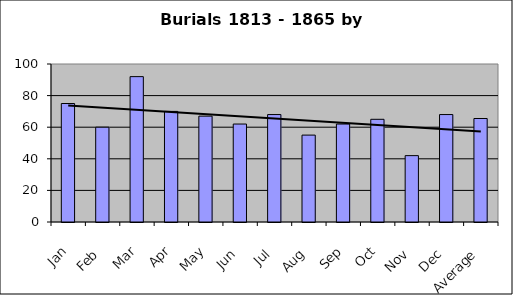
| Category | Series 0 |
|---|---|
| Jan | 75 |
| Feb | 60 |
| Mar | 92 |
| Apr | 70 |
| May | 67 |
| Jun | 62 |
| Jul | 68 |
| Aug | 55 |
| Sep | 62 |
| Oct | 65 |
| Nov | 42 |
| Dec | 68 |
| Average | 65.5 |